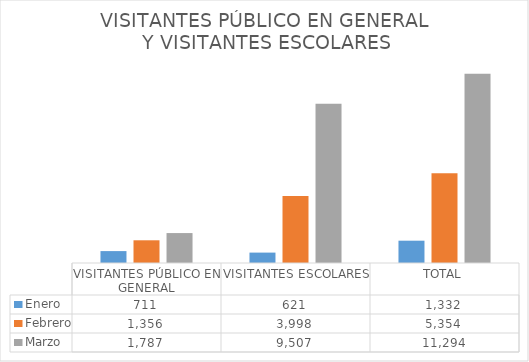
| Category | Enero | Febrero | Marzo |
|---|---|---|---|
| VISITANTES PÚBLICO EN GENERAL | 711 | 1356 | 1787 |
| VISITANTES ESCOLARES | 621 | 3998 | 9507 |
| TOTAL | 1332 | 5354 | 11294 |